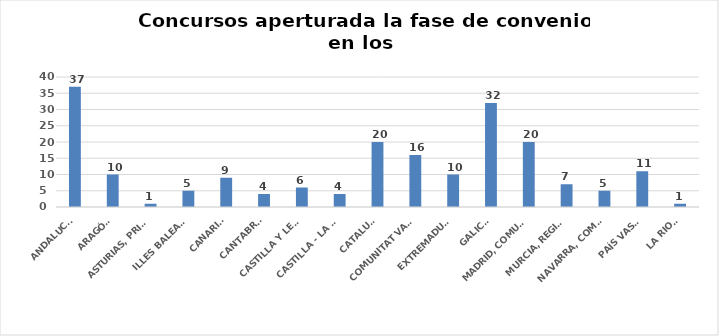
| Category | Series 0 |
|---|---|
| ANDALUCÍA | 37 |
| ARAGÓN | 10 |
| ASTURIAS, PRINCIPADO | 1 |
| ILLES BALEARS | 5 |
| CANARIAS | 9 |
| CANTABRIA | 4 |
| CASTILLA Y LEÓN | 6 |
| CASTILLA - LA MANCHA | 4 |
| CATALUÑA | 20 |
| COMUNITAT VALENCIANA | 16 |
| EXTREMADURA | 10 |
| GALICIA | 32 |
| MADRID, COMUNIDAD | 20 |
| MURCIA, REGIÓN | 7 |
| NAVARRA, COM. FORAL | 5 |
| PAÍS VASCO | 11 |
| LA RIOJA | 1 |